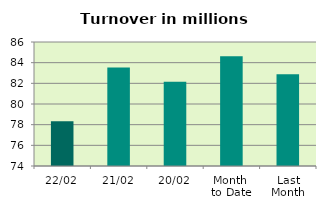
| Category | Series 0 |
|---|---|
| 22/02 | 78.336 |
| 21/02 | 83.533 |
| 20/02 | 82.149 |
| Month 
to Date | 84.621 |
| Last
Month | 82.868 |